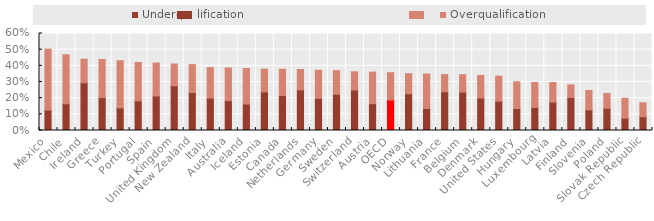
| Category | Underqualification | Overqualification |
|---|---|---|
| Mexico | 0.127 | 0.377 |
| Chile | 0.165 | 0.303 |
| Ireland | 0.296 | 0.145 |
| Greece | 0.203 | 0.236 |
| Turkey | 0.14 | 0.291 |
| Portugal | 0.183 | 0.237 |
| Spain | 0.214 | 0.204 |
| United Kingdom | 0.276 | 0.135 |
| New Zealand | 0.235 | 0.173 |
| Italy | 0.201 | 0.188 |
| Australia | 0.185 | 0.202 |
| Iceland | 0.164 | 0.219 |
| Estonia | 0.239 | 0.141 |
| Canada | 0.217 | 0.162 |
| Netherlands | 0.251 | 0.126 |
| Germany | 0.199 | 0.173 |
| Sweden | 0.224 | 0.146 |
| Switzerland | 0.25 | 0.113 |
| Austria | 0.166 | 0.196 |
| OECD | 0.189 | 0.168 |
| Norway | 0.227 | 0.124 |
| Lithuania | 0.136 | 0.213 |
| France | 0.239 | 0.106 |
| Belgium | 0.238 | 0.107 |
| Denmark | 0.201 | 0.14 |
| United States | 0.181 | 0.155 |
| Hungary | 0.136 | 0.165 |
| Luxembourg | 0.143 | 0.155 |
| Latvia | 0.176 | 0.121 |
| Finland | 0.204 | 0.078 |
| Slovenia | 0.127 | 0.12 |
| Poland | 0.138 | 0.092 |
| Slovak Republic | 0.077 | 0.123 |
| Czech Republic | 0.085 | 0.087 |